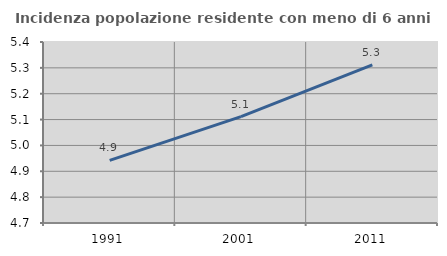
| Category | Incidenza popolazione residente con meno di 6 anni |
|---|---|
| 1991.0 | 4.942 |
| 2001.0 | 5.112 |
| 2011.0 | 5.311 |